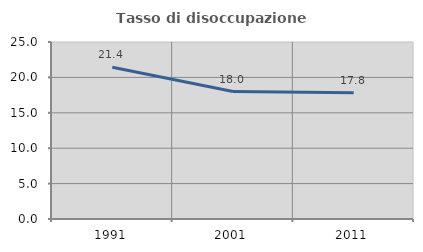
| Category | Tasso di disoccupazione giovanile  |
|---|---|
| 1991.0 | 21.429 |
| 2001.0 | 18 |
| 2011.0 | 17.822 |